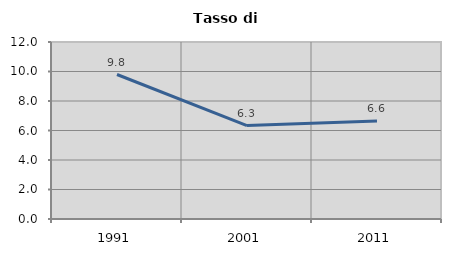
| Category | Tasso di disoccupazione   |
|---|---|
| 1991.0 | 9.796 |
| 2001.0 | 6.337 |
| 2011.0 | 6.643 |